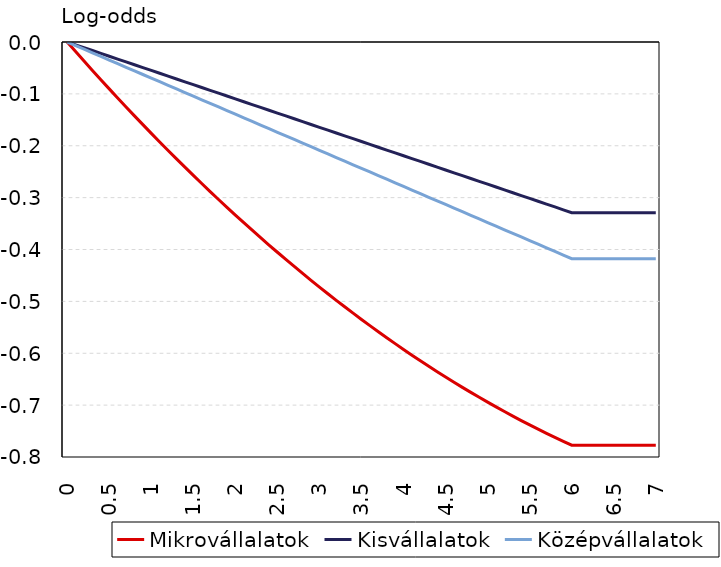
| Category | Mikrovállalatok | Kisvállalatok | Középvállalatok |
|---|---|---|---|
| 0.0 | 0 | 0 | 0 |
| 0.1 | -0.018 | -0.005 | -0.007 |
| 0.2 | -0.037 | -0.011 | -0.014 |
| 0.3 | -0.055 | -0.016 | -0.021 |
| 0.4 | -0.073 | -0.022 | -0.028 |
| 0.5 | -0.09 | -0.027 | -0.035 |
| 0.6 | -0.108 | -0.033 | -0.042 |
| 0.7 | -0.125 | -0.038 | -0.049 |
| 0.8 | -0.142 | -0.044 | -0.056 |
| 0.9 | -0.159 | -0.049 | -0.063 |
| 1.0 | -0.176 | -0.055 | -0.07 |
| 1.1 | -0.193 | -0.06 | -0.077 |
| 1.2 | -0.209 | -0.066 | -0.084 |
| 1.3 | -0.225 | -0.071 | -0.09 |
| 1.4 | -0.241 | -0.077 | -0.097 |
| 1.5 | -0.257 | -0.082 | -0.104 |
| 1.6 | -0.273 | -0.088 | -0.111 |
| 1.7 | -0.288 | -0.093 | -0.118 |
| 1.8 | -0.304 | -0.099 | -0.125 |
| 1.9 | -0.319 | -0.104 | -0.132 |
| 2.0 | -0.334 | -0.11 | -0.139 |
| 2.1 | -0.348 | -0.115 | -0.146 |
| 2.2 | -0.363 | -0.121 | -0.153 |
| 2.3 | -0.377 | -0.126 | -0.16 |
| 2.4 | -0.391 | -0.132 | -0.167 |
| 2.5 | -0.405 | -0.137 | -0.174 |
| 2.6 | -0.419 | -0.143 | -0.181 |
| 2.7 | -0.433 | -0.148 | -0.188 |
| 2.8 | -0.446 | -0.154 | -0.195 |
| 2.9 | -0.459 | -0.159 | -0.202 |
| 3.0 | -0.472 | -0.164 | -0.209 |
| 3.1 | -0.485 | -0.17 | -0.216 |
| 3.2 | -0.498 | -0.175 | -0.223 |
| 3.3 | -0.51 | -0.181 | -0.23 |
| 3.4 | -0.523 | -0.186 | -0.237 |
| 3.5 | -0.535 | -0.192 | -0.244 |
| 3.6 | -0.547 | -0.197 | -0.251 |
| 3.7 | -0.559 | -0.203 | -0.258 |
| 3.8 | -0.57 | -0.208 | -0.265 |
| 3.9 | -0.581 | -0.214 | -0.271 |
| 4.0 | -0.593 | -0.219 | -0.278 |
| 4.1 | -0.604 | -0.225 | -0.285 |
| 4.2 | -0.614 | -0.23 | -0.292 |
| 4.3 | -0.625 | -0.236 | -0.299 |
| 4.4 | -0.636 | -0.241 | -0.306 |
| 4.5 | -0.646 | -0.247 | -0.313 |
| 4.6 | -0.656 | -0.252 | -0.32 |
| 4.7 | -0.666 | -0.258 | -0.327 |
| 4.8 | -0.675 | -0.263 | -0.334 |
| 4.9 | -0.685 | -0.269 | -0.341 |
| 5.0 | -0.694 | -0.274 | -0.348 |
| 5.1 | -0.703 | -0.28 | -0.355 |
| 5.2 | -0.712 | -0.285 | -0.362 |
| 5.3 | -0.721 | -0.291 | -0.369 |
| 5.4 | -0.73 | -0.296 | -0.376 |
| 5.5 | -0.738 | -0.302 | -0.383 |
| 5.6 | -0.746 | -0.307 | -0.39 |
| 5.7 | -0.754 | -0.312 | -0.397 |
| 5.8 | -0.762 | -0.318 | -0.404 |
| 5.9 | -0.77 | -0.323 | -0.411 |
| 6.0 | -0.777 | -0.329 | -0.418 |
| 6.1 | -0.777 | -0.329 | -0.418 |
| 6.2 | -0.777 | -0.329 | -0.418 |
| 6.3 | -0.777 | -0.329 | -0.418 |
| 6.4 | -0.777 | -0.329 | -0.418 |
| 6.5 | -0.777 | -0.329 | -0.418 |
| 6.6 | -0.777 | -0.329 | -0.418 |
| 6.7 | -0.777 | -0.329 | -0.418 |
| 6.8 | -0.777 | -0.329 | -0.418 |
| 6.9 | -0.777 | -0.329 | -0.418 |
| 7.0 | -0.777 | -0.329 | -0.418 |